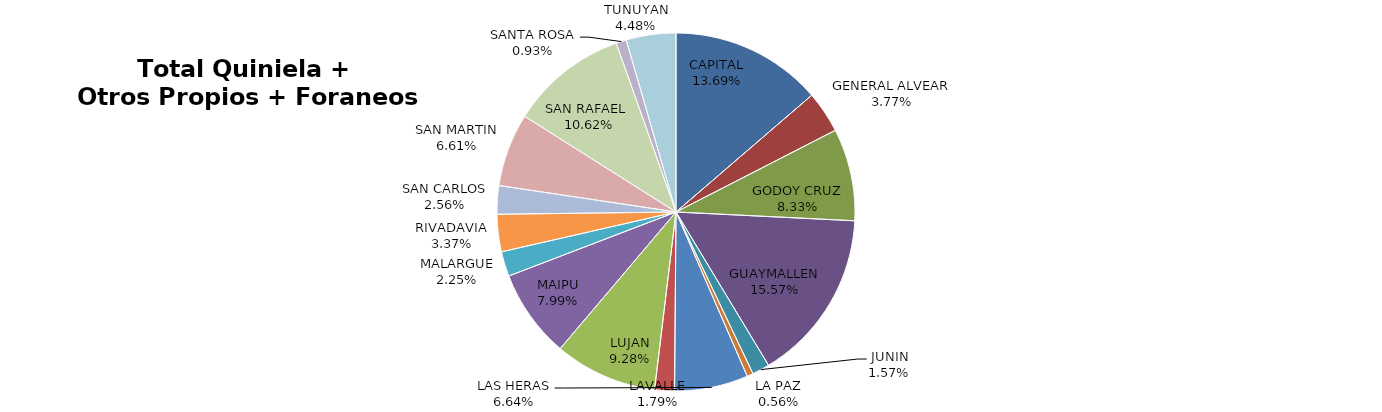
| Category | Total Quiniela + Otros Propios + Foraneos (Beneficio) |
|---|---|
| CAPITAL | 4344776.63 |
| GENERAL ALVEAR | 1195308.38 |
| GODOY CRUZ | 2641169.52 |
| GUAYMALLEN | 4940778.61 |
| JUNIN | 498779.39 |
| LA PAZ | 178288.14 |
| LAS HERAS | 2107540.78 |
| LAVALLE | 566069.03 |
| LUJAN | 2943857.54 |
| MAIPU | 2535472.65 |
| MALARGUE | 713066.82 |
| RIVADAVIA | 1070167.87 |
| SAN CARLOS | 813097.34 |
| SAN MARTIN | 2097050.43 |
| SAN RAFAEL  | 3367787.02 |
| SANTA ROSA | 296121.06 |
| TUNUYAN | 1422413.65 |